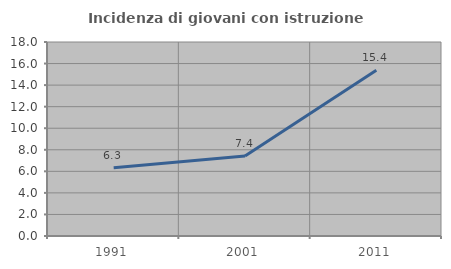
| Category | Incidenza di giovani con istruzione universitaria |
|---|---|
| 1991.0 | 6.338 |
| 2001.0 | 7.429 |
| 2011.0 | 15.385 |